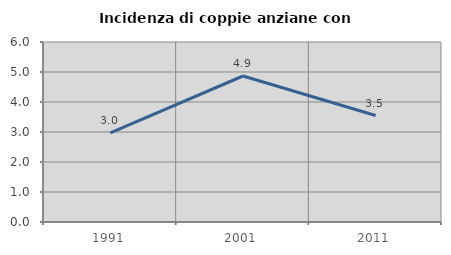
| Category | Incidenza di coppie anziane con figli |
|---|---|
| 1991.0 | 2.97 |
| 2001.0 | 4.867 |
| 2011.0 | 3.549 |